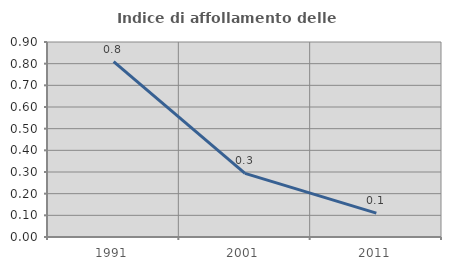
| Category | Indice di affollamento delle abitazioni  |
|---|---|
| 1991.0 | 0.809 |
| 2001.0 | 0.294 |
| 2011.0 | 0.11 |